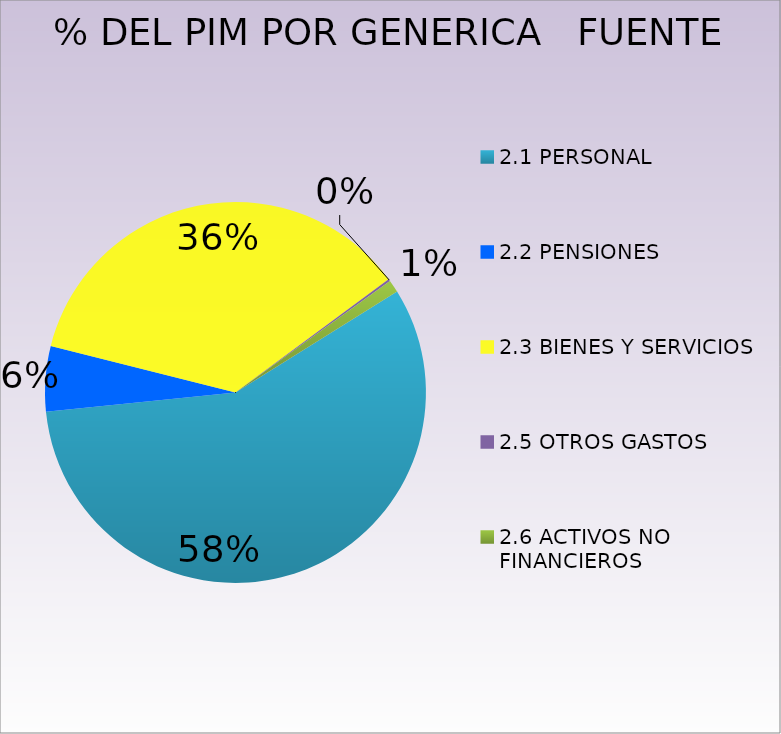
| Category | Series 0 |
|---|---|
| 2.1 PERSONAL | 24399682 |
| 2.2 PENSIONES | 2356422 |
| 2.3 BIENES Y SERVICIOS | 15300000 |
| 2.5 OTROS GASTOS  | 81309 |
| 2.6 ACTIVOS NO FINANCIEROS  | 453602 |